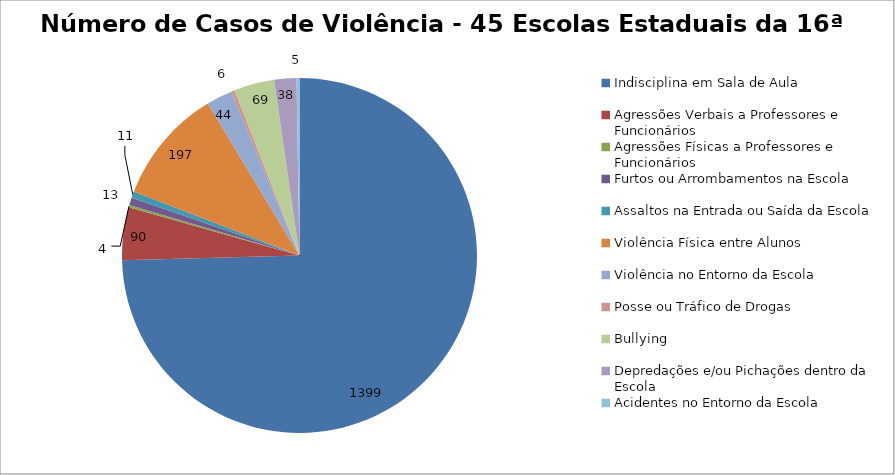
| Category | Número de Casos |
|---|---|
| Indisciplina em Sala de Aula | 1399 |
| Agressões Verbais a Professores e Funcionários | 90 |
| Agressões Físicas a Professores e Funcionários | 4 |
| Furtos ou Arrombamentos na Escola | 13 |
| Assaltos na Entrada ou Saída da Escola | 11 |
| Violência Física entre Alunos | 197 |
| Violência no Entorno da Escola | 44 |
| Posse ou Tráfico de Drogas | 6 |
| Bullying | 69 |
| Depredações e/ou Pichações dentro da Escola | 38 |
| Acidentes no Entorno da Escola | 5 |